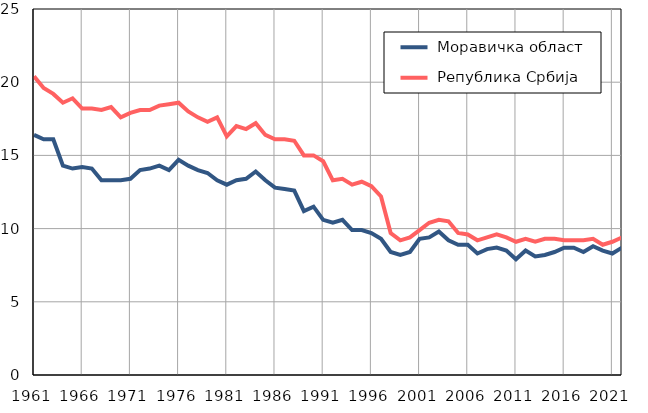
| Category |  Моравичка област |  Република Србија |
|---|---|---|
| 1961.0 | 16.4 | 20.4 |
| 1962.0 | 16.1 | 19.6 |
| 1963.0 | 16.1 | 19.2 |
| 1964.0 | 14.3 | 18.6 |
| 1965.0 | 14.1 | 18.9 |
| 1966.0 | 14.2 | 18.2 |
| 1967.0 | 14.1 | 18.2 |
| 1968.0 | 13.3 | 18.1 |
| 1969.0 | 13.3 | 18.3 |
| 1970.0 | 13.3 | 17.6 |
| 1971.0 | 13.4 | 17.9 |
| 1972.0 | 14 | 18.1 |
| 1973.0 | 14.1 | 18.1 |
| 1974.0 | 14.3 | 18.4 |
| 1975.0 | 14 | 18.5 |
| 1976.0 | 14.7 | 18.6 |
| 1977.0 | 14.3 | 18 |
| 1978.0 | 14 | 17.6 |
| 1979.0 | 13.8 | 17.3 |
| 1980.0 | 13.3 | 17.6 |
| 1981.0 | 13 | 16.3 |
| 1982.0 | 13.3 | 17 |
| 1983.0 | 13.4 | 16.8 |
| 1984.0 | 13.9 | 17.2 |
| 1985.0 | 13.3 | 16.4 |
| 1986.0 | 12.8 | 16.1 |
| 1987.0 | 12.7 | 16.1 |
| 1988.0 | 12.6 | 16 |
| 1989.0 | 11.2 | 15 |
| 1990.0 | 11.5 | 15 |
| 1991.0 | 10.6 | 14.6 |
| 1992.0 | 10.4 | 13.3 |
| 1993.0 | 10.6 | 13.4 |
| 1994.0 | 9.9 | 13 |
| 1995.0 | 9.9 | 13.2 |
| 1996.0 | 9.7 | 12.9 |
| 1997.0 | 9.3 | 12.2 |
| 1998.0 | 8.4 | 9.7 |
| 1999.0 | 8.2 | 9.2 |
| 2000.0 | 8.4 | 9.4 |
| 2001.0 | 9.3 | 9.9 |
| 2002.0 | 9.4 | 10.4 |
| 2003.0 | 9.8 | 10.6 |
| 2004.0 | 9.2 | 10.5 |
| 2005.0 | 8.9 | 9.7 |
| 2006.0 | 8.9 | 9.6 |
| 2007.0 | 8.3 | 9.2 |
| 2008.0 | 8.6 | 9.4 |
| 2009.0 | 8.7 | 9.6 |
| 2010.0 | 8.5 | 9.4 |
| 2011.0 | 7.9 | 9.1 |
| 2012.0 | 8.5 | 9.3 |
| 2013.0 | 8.1 | 9.1 |
| 2014.0 | 8.2 | 9.3 |
| 2015.0 | 8.4 | 9.3 |
| 2016.0 | 8.7 | 9.2 |
| 2017.0 | 8.7 | 9.2 |
| 2018.0 | 8.4 | 9.2 |
| 2019.0 | 8.8 | 9.3 |
| 2020.0 | 8.5 | 8.9 |
| 2021.0 | 8.3 | 9.1 |
| 2022.0 | 8.7 | 9.4 |